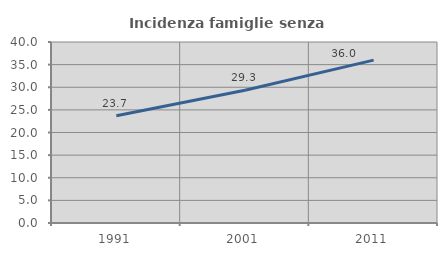
| Category | Incidenza famiglie senza nuclei |
|---|---|
| 1991.0 | 23.703 |
| 2001.0 | 29.326 |
| 2011.0 | 35.987 |